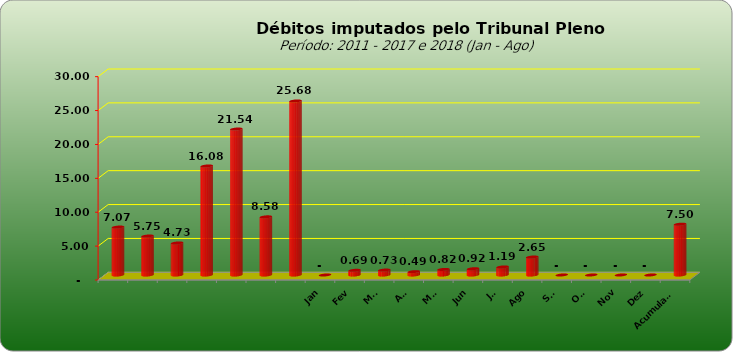
| Category |  7.073.154,74  |
|---|---|
|  | 7073154.74 |
|  | 5749129.25 |
|  | 4727033.51 |
|  | 16081820.48 |
|  | 21535723.6 |
|  | 8578266.09 |
|  | 25676499.17 |
| Jan | 0 |
| Fev | 689867.86 |
| Mar | 729624.1 |
| Abr | 491509.68 |
| Mai | 824303.32 |
| Jun | 924019.84 |
| Jul | 1188655.7 |
| Ago | 2651249.45 |
| Set | 0 |
| Out | 0 |
| Nov | 0 |
| Dez | 0 |
| Acumulado | 7496597.5 |